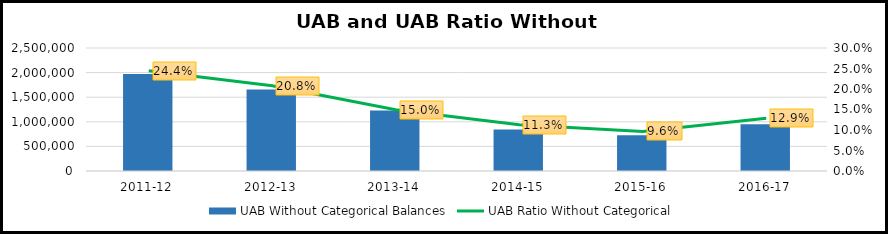
| Category | UAB Without Categorical Balances |
|---|---|
| 2011-12 | 1972125 |
| 2012-13 | 1657901 |
| 2013-14 | 1230554 |
| 2014-15 | 845685 |
| 2015-16 | 726606.7 |
| 2016-17 | 951951.99 |